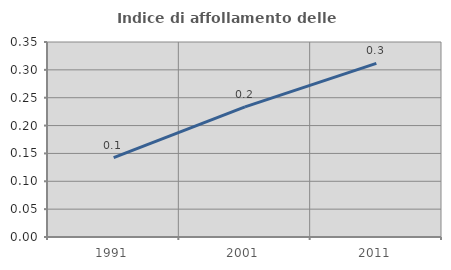
| Category | Indice di affollamento delle abitazioni  |
|---|---|
| 1991.0 | 0.143 |
| 2001.0 | 0.234 |
| 2011.0 | 0.312 |